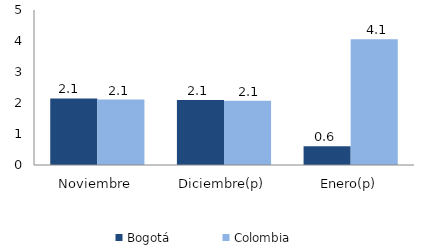
| Category | Bogotá | Colombia |
|---|---|---|
| Noviembre | 2.148 | 2.111 |
| Diciembre(p) | 2.093 | 2.069 |
| Enero(p) | 0.601 | 4.053 |